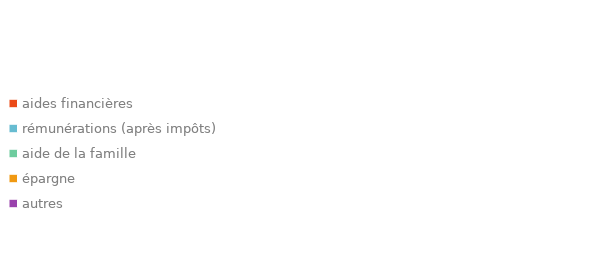
| Category | Series 0 |
|---|---|
| aides financières | 0 |
| rémunérations (après impôts) | 0 |
| aide de la famille | 0 |
| épargne | 0 |
| autres | 0 |